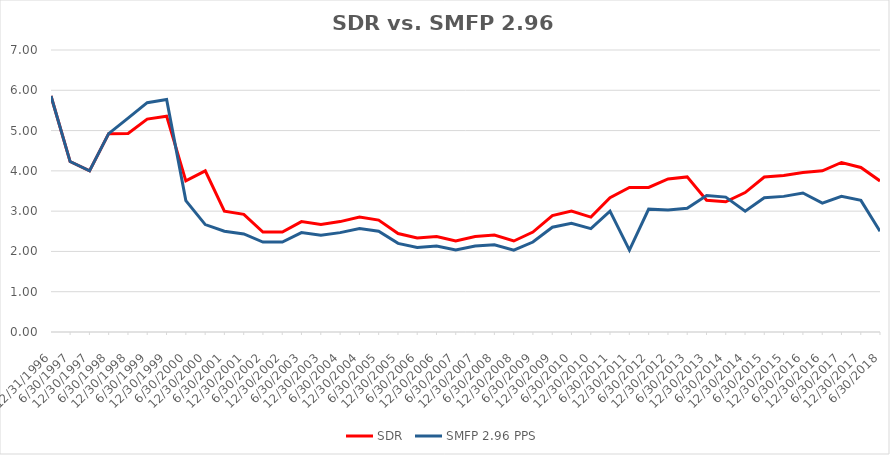
| Category | SDR | SMFP 2.96 PPS |
|---|---|---|
| 12/31/96 | 5.857 | 5.857 |
| 6/30/97 | 4.231 | 4.231 |
| 12/31/97 | 4 | 4 |
| 6/30/98 | 4.923 | 4.923 |
| 12/31/98 | 4.929 | 5.308 |
| 6/30/99 | 5.286 | 5.692 |
| 12/31/99 | 5.357 | 5.769 |
| 6/30/00 | 3.75 | 3.261 |
| 12/31/00 | 4 | 2.667 |
| 6/30/01 | 3 | 2.5 |
| 12/31/01 | 2.92 | 2.433 |
| 6/30/02 | 2.481 | 2.233 |
| 12/31/02 | 2.481 | 2.233 |
| 6/30/03 | 2.741 | 2.467 |
| 12/31/03 | 2.667 | 2.4 |
| 6/30/04 | 2.741 | 2.467 |
| 12/31/04 | 2.852 | 2.567 |
| 6/30/05 | 2.778 | 2.5 |
| 12/31/05 | 2.444 | 2.2 |
| 6/30/06 | 2.333 | 2.1 |
| 12/31/06 | 2.37 | 2.133 |
| 6/30/07 | 2.259 | 2.033 |
| 12/31/07 | 2.37 | 2.133 |
| 6/30/08 | 2.407 | 2.167 |
| 12/31/08 | 2.259 | 2.033 |
| 6/30/09 | 2.481 | 2.233 |
| 12/31/09 | 2.889 | 2.6 |
| 6/30/10 | 3 | 2.7 |
| 12/31/10 | 2.852 | 2.567 |
| 6/30/11 | 3.333 | 3 |
| 12/31/11 | 3.588 | 2.033 |
| 6/30/12 | 3.588 | 3.05 |
| 12/31/12 | 3.8 | 3.03 |
| 6/30/13 | 3.85 | 3.07 |
| 12/31/13 | 3.269 | 3.389 |
| 6/30/14 | 3.231 | 3.349 |
| 12/31/14 | 3.462 | 3 |
| 6/30/15 | 3.846 | 3.333 |
| 12/31/15 | 3.885 | 3.367 |
| 6/30/16 | 3.958 | 3.45 |
| 12/31/16 | 4 | 3.2 |
| 6/30/17 | 4.208 | 3.367 |
| 12/31/17 | 4.083 | 3.267 |
| 6/30/18 | 3.75 | 2.5 |